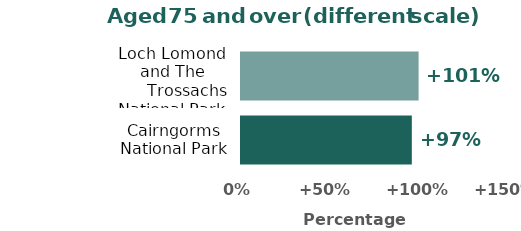
| Category | Aged 75 and over |
|---|---|
| Cairngorms National Park | 96.689 |
| Loch Lomond and The
      Trossachs National Park | 100.526 |